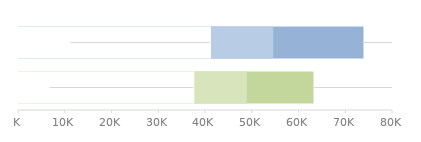
| Category | 75% | 50% | 25% |
|---|---|---|---|
| 0 | 73687.5 | 54375 | 41062.5 |
| 1 | 63000 | 48750 | 37500 |